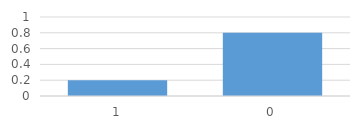
| Category | Series 0 |
|---|---|
| 0 | 0.2 |
| 1 | 0.8 |